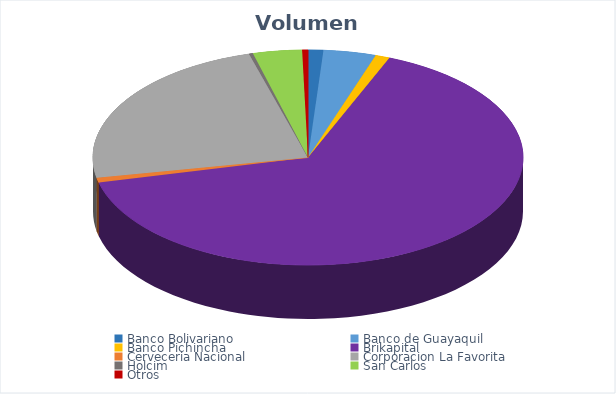
| Category | VOLUMEN ($USD) |
|---|---|
| Banco Bolivariano | 5280 |
| Banco de Guayaquil | 18169.93 |
| Banco Pichincha | 5000 |
| Brikapital | 300000 |
| Cerveceria Nacional | 3420 |
| Corporacion La Favorita | 108748.95 |
| Holcim | 1380 |
| San Carlos | 17000 |
| Otros | 2000 |